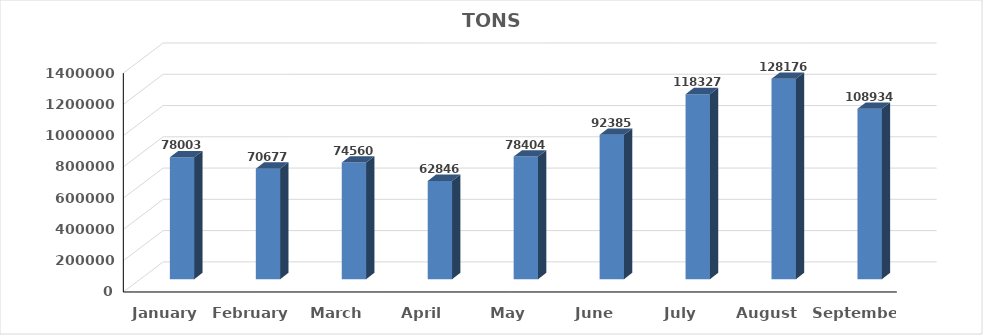
| Category | TONS |
|---|---|
| January | 780030 |
| February | 706772 |
| March | 745601 |
| April | 628464 |
| May | 784040 |
| June | 923852 |
| July | 1183271 |
| August | 1281760 |
| September | 1089346 |